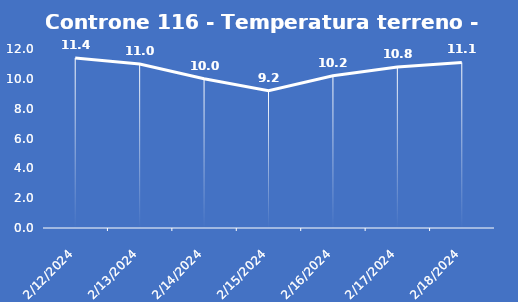
| Category | Controne 116 - Temperatura terreno - Grezzo (°C) |
|---|---|
| 2/12/24 | 11.4 |
| 2/13/24 | 11 |
| 2/14/24 | 10 |
| 2/15/24 | 9.2 |
| 2/16/24 | 10.2 |
| 2/17/24 | 10.8 |
| 2/18/24 | 11.1 |